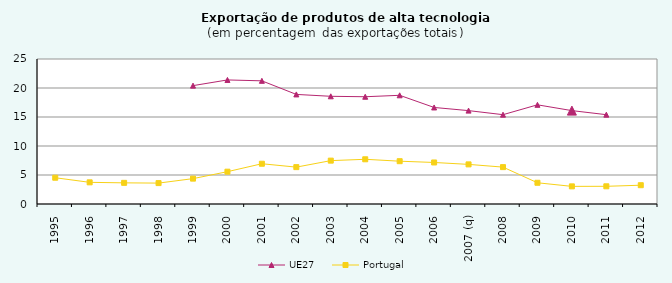
| Category | UE27  | Portugal |
|---|---|---|
| 1995 | 0 | 4.529 |
| 1996 | 0 | 3.735 |
| 1997 | 0 | 3.646 |
| 1998 | 0 | 3.602 |
| 1999 | 20.409 | 4.374 |
| 2000 | 21.39 | 5.573 |
| 2001 | 21.235 | 6.94 |
| 2002 | 18.895 | 6.356 |
| 2003 | 18.568 | 7.477 |
| 2004 | 18.492 | 7.71 |
| 2005 | 18.74 | 7.38 |
| 2006 | 16.645 | 7.16 |
| 2007 (q) | 16.1 | 6.83 |
| 2008 | 15.4 | 6.36 |
| 2009 | 17.1 | 3.66 |
| 2010 | 16.1 | 3.04 |
| 2011 | 15.4 | 3.05 |
| 2012 | 0 | 3.24 |